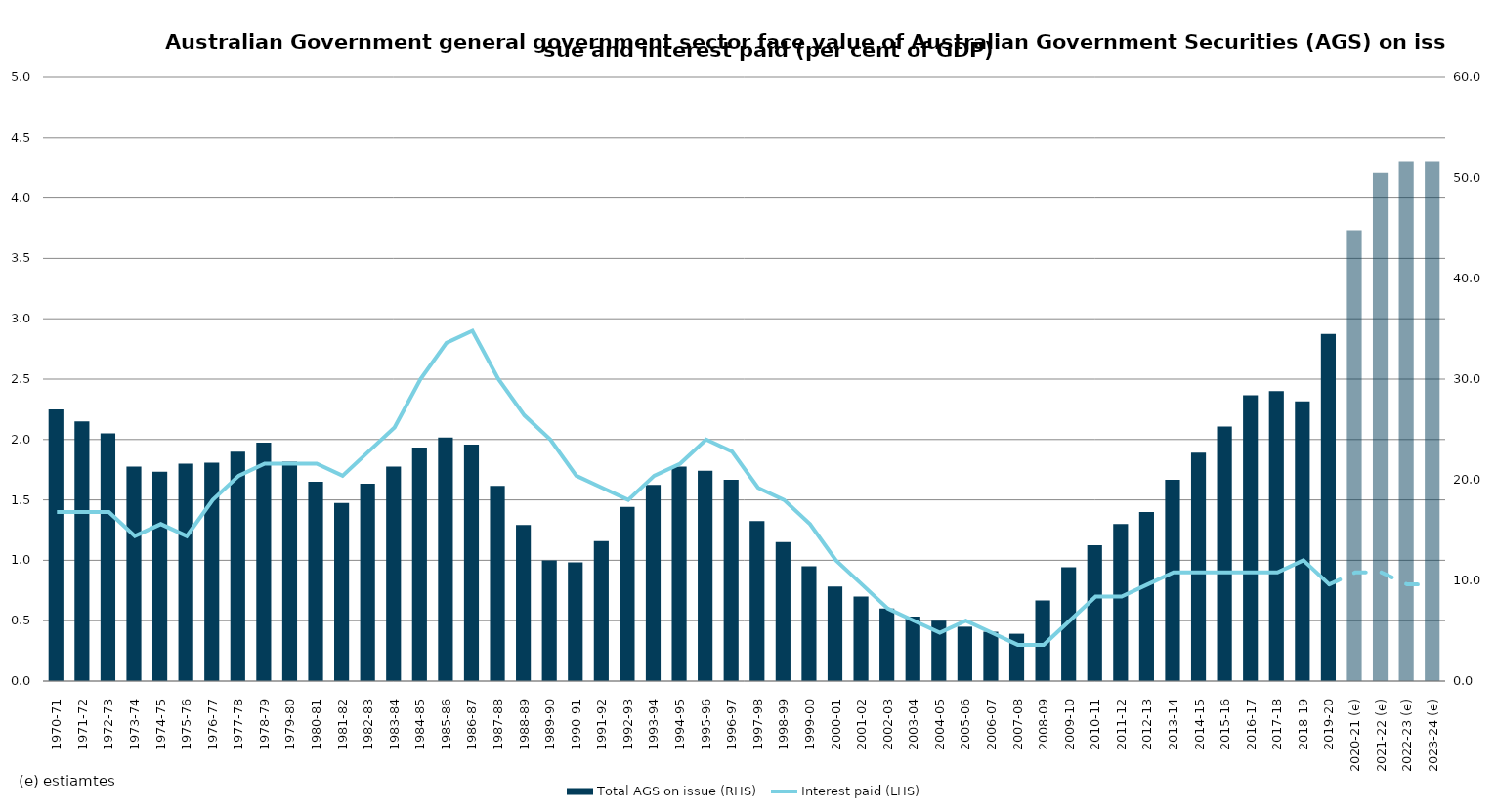
| Category | Total AGS on issue (RHS) |
|---|---|
| 1970-71 | 27 |
| 1971-72 | 25.8 |
| 1972-73 | 24.6 |
| 1973-74 | 21.3 |
| 1974-75 | 20.8 |
| 1975-76 | 21.6 |
| 1976-77 | 21.7 |
| 1977-78 | 22.8 |
| 1978-79 | 23.7 |
| 1979-80 | 21.8 |
| 1980-81 | 19.8 |
| 1981-82 | 17.7 |
| 1982-83 | 19.6 |
| 1983-84 | 21.3 |
| 1984-85 | 23.2 |
| 1985-86 | 24.2 |
| 1986-87 | 23.5 |
| 1987-88 | 19.4 |
| 1988-89 | 15.5 |
| 1989-90 | 12 |
| 1990-91 | 11.8 |
| 1991-92 | 13.9 |
| 1992-93 | 17.3 |
| 1993-94 | 19.5 |
| 1994-95 | 21.3 |
| 1995-96 | 20.9 |
| 1996-97 | 20 |
| 1997-98 | 15.9 |
| 1998-99 | 13.8 |
| 1999-00 | 11.4 |
| 2000-01 | 9.4 |
| 2001-02 | 8.4 |
| 2002-03 | 7.2 |
| 2003-04 | 6.4 |
| 2004-05 | 6 |
| 2005-06 | 5.4 |
| 2006-07 | 4.9 |
| 2007-08 | 4.7 |
| 2008-09 | 8 |
| 2009-10 | 11.3 |
| 2010-11 | 13.5 |
| 2011-12 | 15.6 |
| 2012-13 | 16.8 |
| 2013-14 | 20 |
| 2014-15 | 22.7 |
| 2015-16 | 25.3 |
| 2016-17 | 28.4 |
| 2017-18 | 28.8 |
| 2018-19 | 27.8 |
| 2019-20 | 34.5 |
| 2020-21 (e) | 44.8 |
| 2021-22 (e) | 50.5 |
| 2022-23 (e) | 51.6 |
| 2023-24 (e) | 51.6 |